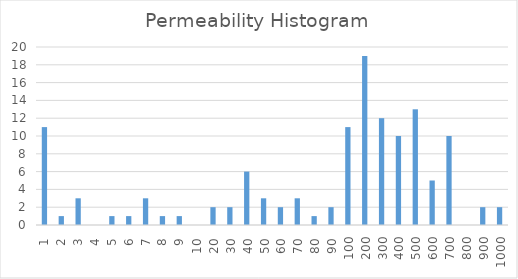
| Category | Series 0 |
|---|---|
| 1.0 | 11 |
| 2.0 | 1 |
| 3.0 | 3 |
| 4.0 | 0 |
| 5.0 | 1 |
| 6.0 | 1 |
| 7.0 | 3 |
| 8.0 | 1 |
| 9.0 | 1 |
| 10.0 | 0 |
| 20.0 | 2 |
| 30.0 | 2 |
| 40.0 | 6 |
| 50.0 | 3 |
| 60.0 | 2 |
| 70.0 | 3 |
| 80.0 | 1 |
| 90.0 | 2 |
| 100.0 | 11 |
| 200.0 | 19 |
| 300.0 | 12 |
| 400.0 | 10 |
| 500.0 | 13 |
| 600.0 | 5 |
| 700.0 | 10 |
| 800.0 | 0 |
| 900.0 | 2 |
| 1000.0 | 2 |